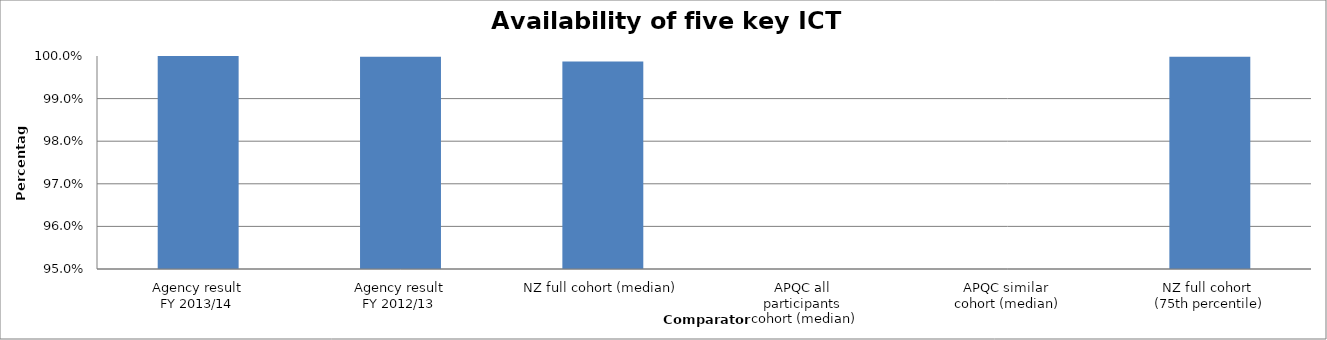
| Category | Result |
|---|---|
| Agency result
FY 2013/14 | 1 |
| Agency result
FY 2012/13 | 1 |
| NZ full cohort (median) | 0.999 |
| APQC all 
participants 
cohort (median) | 0 |
| APQC similar 
cohort (median) | 0 |
| NZ full cohort 
(75th percentile) | 1 |